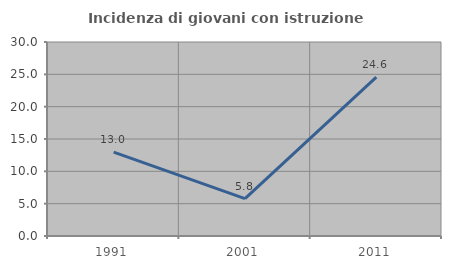
| Category | Incidenza di giovani con istruzione universitaria |
|---|---|
| 1991.0 | 12.963 |
| 2001.0 | 5.769 |
| 2011.0 | 24.561 |